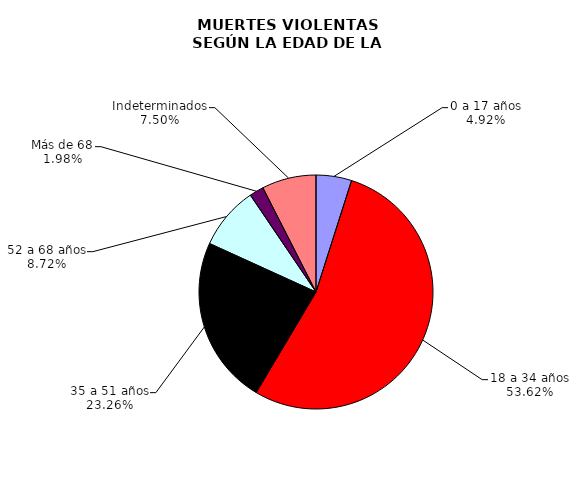
| Category | Series 0 |
|---|---|
| 0 a 17 años | 97 |
| 18 a 34 años | 1058 |
| 35 a 51 años | 459 |
| 52 a 68 años | 172 |
| Más de 68 | 39 |
| Indeterminados | 148 |